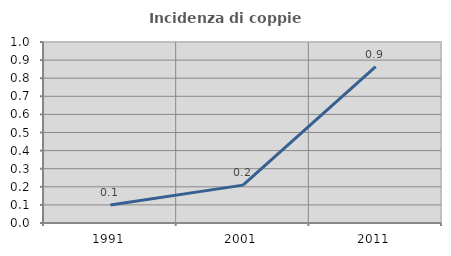
| Category | Incidenza di coppie miste |
|---|---|
| 1991.0 | 0.1 |
| 2001.0 | 0.209 |
| 2011.0 | 0.864 |